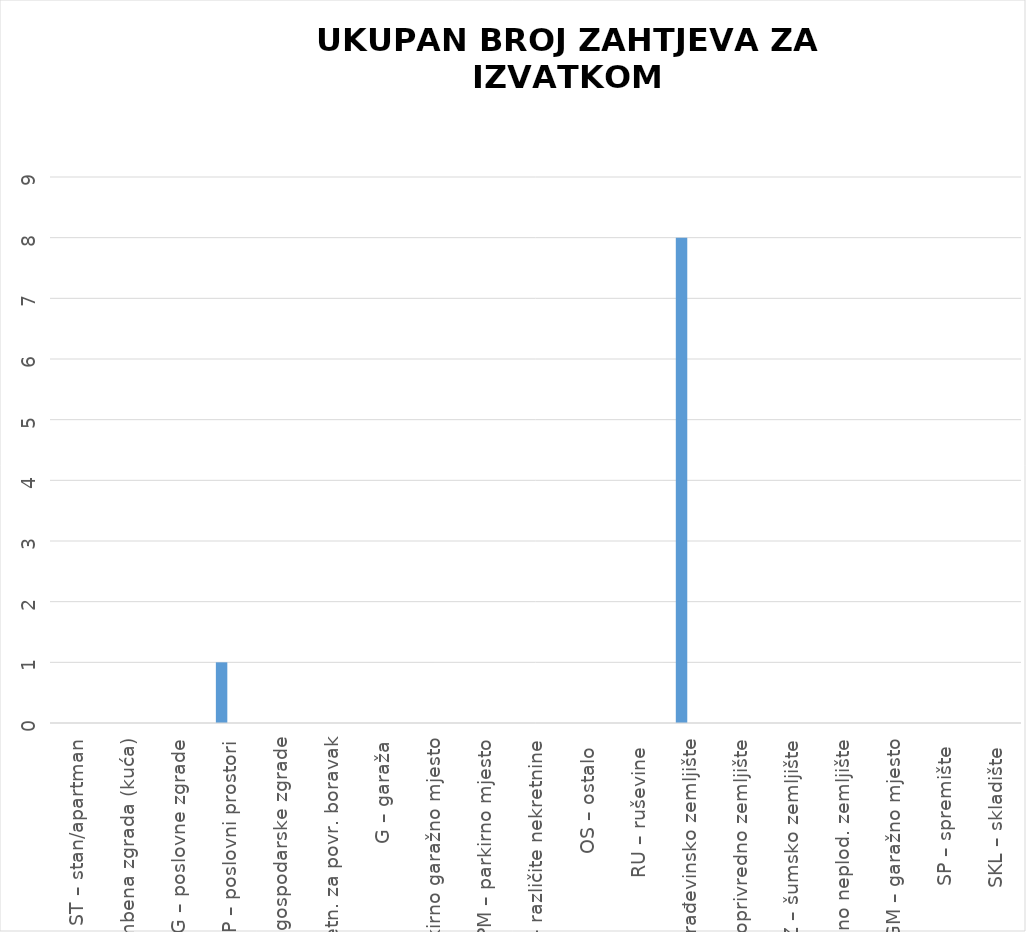
| Category | BROJ ZAPRIMLJENIH ZAHTJEVA KROZ APLIKACIJU eNekretnine | BROJ ZAPRIMLJENIH ZAHTJEVA IZVAN APLIKACIJE
(Popunjava službenik) |
|---|---|---|
| ST – stan/apartman | 0 | 0 |
| OK – stambena zgrada (kuća) | 0 | 0 |
| PZG – poslovne zgrade | 0 | 0 |
| PP – poslovni prostori | 1 | 0 |
| GZG – gospodarske zgrade | 0 | 0 |
| VIK – nekretn. za povr. boravak | 0 | 0 |
| G – garaža | 0 | 0 |
| PGM – parkirno garažno mjesto | 0 | 0 |
| VPM – parkirno mjesto | 0 | 0 |
| RN – različite nekretnine | 0 | 0 |
| OS – ostalo  | 0 | 0 |
| RU – ruševine  | 0 | 0 |
| GZ – građevinsko zemljište | 8 | 0 |
| PZ – poljoprivredno zemljište | 0 | 0 |
| ŠZ – šumsko zemljište | 0 | 0 |
| PNZ – prirodno neplod. zemljište | 0 | 0 |
| GM – garažno mjesto | 0 | 0 |
| SP – spremište  | 0 | 0 |
| SKL – skladište  | 0 | 0 |